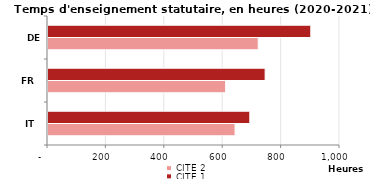
| Category | CITE 2 | CITE 1 |
|---|---|---|
| IT | 640.659 | 691.162 |
| FR | 608.4 | 743.6 |
| DE | 720 | 900 |